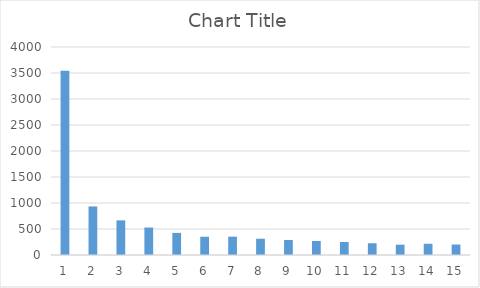
| Category | Series 0 |
|---|---|
| 0 | 3542 |
| 1 | 934 |
| 2 | 666 |
| 3 | 528 |
| 4 | 425 |
| 5 | 351 |
| 6 | 353 |
| 7 | 313 |
| 8 | 288 |
| 9 | 269 |
| 10 | 250 |
| 11 | 226 |
| 12 | 198 |
| 13 | 216 |
| 14 | 201 |